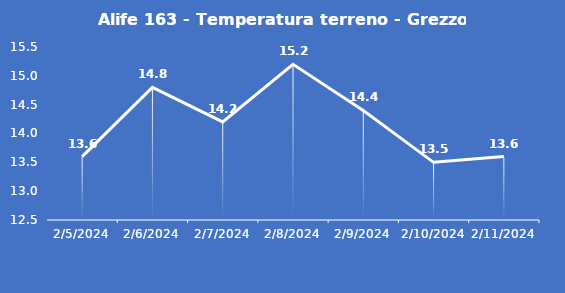
| Category | Alife 163 - Temperatura terreno - Grezzo (°C) |
|---|---|
| 2/5/24 | 13.6 |
| 2/6/24 | 14.8 |
| 2/7/24 | 14.2 |
| 2/8/24 | 15.2 |
| 2/9/24 | 14.4 |
| 2/10/24 | 13.5 |
| 2/11/24 | 13.6 |